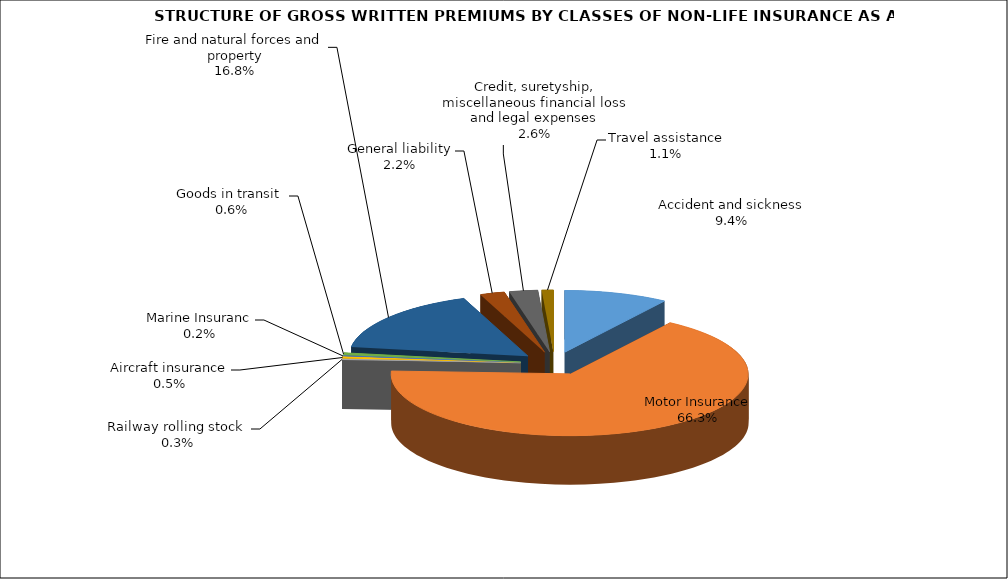
| Category | Accident and sickness | Series 1 |
|---|---|---|
| Accident and sickness | 0.094 |  |
| Motor Insurance | 0.663 |  |
| Railway rolling stock  | 0.003 |  |
| Aircraft insurance | 0.005 |  |
| Marine Insuranc | 0.002 |  |
| Goods in transit  | 0.006 |  |
| Fire and natural forces and property | 0.168 |  |
| General liability | 0.022 |  |
| Credit, suretyship, miscellaneous financial loss and legal expenses | 0.026 |  |
| Travel assistance | 0.011 |  |